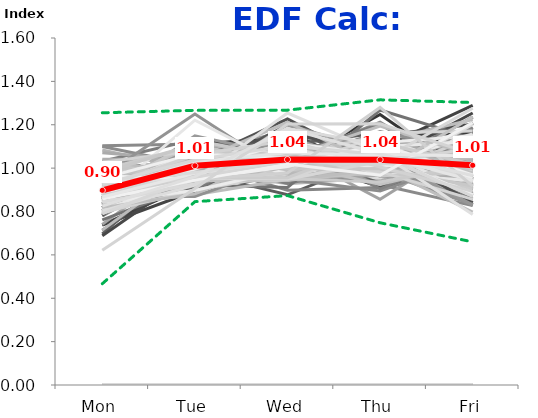
| Category | 1/1/96 | 1/8/96 | 1/15/96 | 1/22/96 | 1/29/96 | 2/5/96 | 2/12/96 | 2/19/96 | 2/26/96 | 3/4/96 | 3/11/96 | 3/18/96 | 3/25/96 | 4/1/96 | 4/8/96 | 4/15/96 | 4/22/96 | 4/29/96 | 5/6/96 | 5/13/96 | 5/20/96 | 5/27/96 | 6/3/96 | 6/10/96 | 6/17/96 | 6/24/96 | 7/1/96 | 7/8/96 | 7/15/96 | 7/22/96 | 7/29/96 | 8/5/96 | 8/12/96 | 8/19/96 | 8/26/96 | 9/2/96 | 9/9/96 | 9/16/96 | 9/23/96 | 9/30/96 | 10/7/96 | 10/14/96 | 10/21/96 | 10/28/96 | 11/4/96 | 11/11/96 | 11/18/96 | 11/25/96 | 12/2/96 | 12/9/96 | 12/16/96 | 12/23/96 | 12/30/96 | 1/6/97 | 1/13/97 | 1/20/97 | 1/27/97 | 2/3/97 | 2/10/97 | 2/17/97 | 2/24/97 | 3/3/97 | 3/10/97 | 3/17/97 | 3/24/97 | 3/31/97 | 4/7/97 | 4/14/97 | 4/21/97 | 4/28/97 | 5/5/97 | 5/12/97 | 5/19/97 | 5/26/97 | 6/2/97 | 6/9/97 | 6/16/97 | 6/23/97 | 6/30/97 | 7/7/97 | 7/14/97 | 7/21/97 | 7/28/97 | 8/4/97 | 8/11/97 | 8/18/97 | 8/25/97 | 9/1/97 | 9/8/97 | 9/15/97 | 9/22/97 | 9/29/97 | 10/6/97 | 10/13/97 | 10/20/97 | 10/27/97 | 11/3/97 | 11/10/97 | 11/17/97 | 11/24/97 | 12/1/97 | 12/8/97 | 12/15/97 | 12/22/97 | 12/29/97 | 1/5/98 | 1/12/98 | 1/19/98 | 1/26/98 | 2/2/98 | 2/9/98 | 2/16/98 | 2/23/98 | 3/2/98 | 3/9/98 | 3/16/98 | 3/23/98 | 3/30/98 | 4/6/98 | 4/13/98 | 4/20/98 | 4/27/98 | 5/4/98 | 5/11/98 | 5/18/98 | 5/25/98 | 6/1/98 | 6/8/98 | 6/15/98 | 6/22/98 | 6/29/98 | 7/6/98 | 7/13/98 | 7/20/98 | 7/27/98 | 8/3/98 | 8/10/98 | 8/17/98 | 8/24/98 | 8/31/98 | 9/7/98 | 9/14/98 | 9/21/98 | 9/28/98 | 10/5/98 | 10/12/98 | 10/19/98 | 10/26/98 | 11/2/98 | 11/9/98 | 11/16/98 | 11/23/98 | 11/30/98 | 12/7/98 | 12/14/98 | 12/21/98 | 12/28/98 | 1/4/99 | 1/11/99 | 1/18/99 | 1/25/99 | 2/1/99 | 2/8/99 | 2/15/99 | 2/22/99 | 3/1/99 | 3/8/99 | 3/15/99 | 3/22/99 | 3/29/99 | 4/5/99 | 4/12/99 | 4/19/99 | 4/26/99 | 5/3/99 | 5/10/99 | 5/17/99 | 5/24/99 | 5/31/99 | 6/7/99 | 6/14/99 | 6/21/99 | 6/28/99 | 7/5/99 | 7/12/99 | 7/19/99 | 7/26/99 | 8/2/99 | 8/9/99 | 8/16/99 | 8/23/99 | 8/30/99 | 9/6/99 | 9/13/99 | 9/20/99 | 9/27/99 | 10/4/99 | 10/11/99 | 10/18/99 | 10/25/99 | 11/1/99 | 11/8/99 | 11/15/99 | 11/22/99 | 11/29/99 | 12/6/99 | 12/13/99 | 12/20/99 | 12/27/99 | 1/3/00 | 1/10/00 | 1/17/00 | 1/24/00 | 1/31/00 | 2/7/00 | 2/14/00 | 2/21/00 | 2/28/00 | 3/6/00 | 3/13/00 | 3/20/00 | 3/27/00 | 4/3/00 | 4/10/00 | 4/17/00 | 4/24/00 | 5/1/00 | 5/8/00 | 5/15/00 | 5/22/00 | 5/29/00 | 6/5/00 | 6/12/00 | 6/19/00 | 6/26/00 | 7/3/00 | 7/10/00 | 7/17/00 | 7/24/00 | 7/31/00 | 8/7/00 | 8/14/00 | 8/21/00 | 8/28/00 | 9/4/00 | 9/11/00 | 9/18/00 | 9/25/00 | 10/2/00 | 10/9/00 | 10/16/00 | Min: | Max: | FINAL: |
|---|---|---|---|---|---|---|---|---|---|---|---|---|---|---|---|---|---|---|---|---|---|---|---|---|---|---|---|---|---|---|---|---|---|---|---|---|---|---|---|---|---|---|---|---|---|---|---|---|---|---|---|---|---|---|---|---|---|---|---|---|---|---|---|---|---|---|---|---|---|---|---|---|---|---|---|---|---|---|---|---|---|---|---|---|---|---|---|---|---|---|---|---|---|---|---|---|---|---|---|---|---|---|---|---|---|---|---|---|---|---|---|---|---|---|---|---|---|---|---|---|---|---|---|---|---|---|---|---|---|---|---|---|---|---|---|---|---|---|---|---|---|---|---|---|---|---|---|---|---|---|---|---|---|---|---|---|---|---|---|---|---|---|---|---|---|---|---|---|---|---|---|---|---|---|---|---|---|---|---|---|---|---|---|---|---|---|---|---|---|---|---|---|---|---|---|---|---|---|---|---|---|---|---|---|---|---|---|---|---|---|---|---|---|---|---|---|---|---|---|---|---|---|---|---|---|---|---|---|---|---|---|---|---|---|---|---|---|---|---|---|---|---|---|---|---|---|---|---|---|---|---|---|---|---|
| Mon | 0 | 0 | 0.714 | 0.934 | 0.832 | 0.836 | 0.944 | 0 | 0.906 | 0.921 | 0.954 | 1.103 | 0.874 | 0 | 0.928 | 0.819 | 0.903 | 0.852 | 0.888 | 0.932 | 0.973 | 0 | 0.795 | 0.873 | 0.739 | 0.839 | 0 | 0.88 | 0 | 0.844 | 0.737 | 0.898 | 0.929 | 0.895 | 0.959 | 0 | 0.799 | 0.978 | 0.696 | 0.936 | 0.947 | 0.741 | 1.009 | 0.864 | 0.865 | 0.781 | 0.83 | 0 | 0.856 | 0.837 | 0.845 | 0 | 0 | 0.968 | 0.864 | 0.78 | 0.861 | 0.888 | 0.903 | 0 | 0.905 | 0.855 | 0.957 | 0.976 | 0 | 1.083 | 1.013 | 0.851 | 0.855 | 0.817 | 1.031 | 0.96 | 0.787 | 0 | 0.907 | 0.871 | 0.792 | 0.945 | 0 | 0.965 | 0.827 | 0.837 | 0.881 | 0.848 | 0.911 | 1.015 | 0.865 | 0 | 0.886 | 0.806 | 0.911 | 0.86 | 0.932 | 0.688 | 0.799 | 0 | 1.026 | 0 | 1.013 | 0 | 0.99 | 0.864 | 0.925 | 0 | 0 | 0.945 | 1.1 | 0 | 0.837 | 1.071 | 0.924 | 0 | 0.937 | 0.937 | 1.005 | 0.863 | 1.014 | 0.783 | 0 | 0.875 | 0.919 | 1.041 | 0.95 | 0.945 | 0.969 | 0 | 0.95 | 0.913 | 0.898 | 0.858 | 0 | 0.86 | 0.872 | 0.827 | 0.939 | 0.804 | 0.859 | 0.897 | 0.762 | 0 | 0 | 0.958 | 0.814 | 0.848 | 0.882 | 0.828 | 0.963 | 0.862 | 1.006 | 0.903 | 0.913 | 0 | 0.928 | 0.946 | 0.97 | 0 | 0 | 1 | 0.988 | 0 | 0.849 | 0.94 | 0.961 | 0 | 0.944 | 0.885 | 0.872 | 0.913 | 0.887 | 0 | 0.9 | 0.867 | 0 | 0.791 | 0.931 | 0.974 | 0.924 | 0.954 | 0 | 0.97 | 0.884 | 0.993 | 0 | 0 | 0.923 | 0.893 | 0.871 | 0.869 | 0.912 | 0.883 | 0.957 | 0.858 | 0 | 0.87 | 0.714 | 0.879 | 0.919 | 0.808 | 0.885 | 0.796 | 0.922 | 0.909 | 0.869 | 0 | 0.932 | 0.904 | 0.895 | 0 | 0 | 0.872 | 1.03 | 0 | 1.009 | 0.959 | 0.908 | 0.906 | 0 | 0.877 | 0.884 | 0.818 | 0.886 | 0.843 | 0 | 0.803 | 0 | 0.865 | 1.027 | 0.875 | 0.99 | 0.945 | 0 | 0.977 | 0.79 | 0.954 | 0 | 0 | 0.864 | 0.952 | 0.843 | 0.965 | 0.914 | 0.9 | 0.928 | 0.876 | 0 | 0.858 | 0.899 | 0.867 | 0.93 | 0.622 | 0.825 | 0.467 | 1.255 | 0.898 |
| Tue | 0 | 0 | 0.992 | 0.978 | 1.064 | 1.031 | 1.037 | 0 | 0.979 | 0.984 | 0.98 | 1.111 | 1.05 | 0 | 0.947 | 1.071 | 1.03 | 0.974 | 0.97 | 1.083 | 1.035 | 0 | 0.968 | 1.05 | 0.931 | 0.985 | 0 | 0.909 | 0 | 1.068 | 0.894 | 1.014 | 1.078 | 1.019 | 1.058 | 0 | 0.955 | 1.025 | 1.069 | 1.001 | 1.079 | 1.056 | 1 | 1 | 1.068 | 1.043 | 0.987 | 0 | 1.068 | 0.98 | 0.981 | 0 | 0 | 0.988 | 1.031 | 1.011 | 1.046 | 0.97 | 0.929 | 0 | 1.061 | 1.052 | 1.006 | 0.918 | 0 | 0.99 | 1.006 | 1.066 | 1.1 | 1.113 | 1.132 | 1.022 | 1.028 | 0 | 1.112 | 0.98 | 1.03 | 1.051 | 0 | 0.986 | 1.012 | 1.053 | 1.035 | 0.977 | 0.947 | 1.088 | 1.069 | 0 | 0.958 | 1.104 | 0.977 | 1.078 | 1.031 | 0.986 | 0.959 | 0 | 0.97 | 0 | 0.915 | 0 | 0.965 | 0.953 | 0.974 | 0 | 0 | 0.94 | 1.012 | 0 | 1.034 | 1.035 | 1.103 | 0 | 0.995 | 0.968 | 1.022 | 1.071 | 0.987 | 1.062 | 0 | 0.948 | 1.039 | 1.04 | 1.005 | 1.018 | 1.063 | 0 | 1.041 | 0.947 | 1.001 | 1.06 | 0 | 1.053 | 1.062 | 0.979 | 1.066 | 1.104 | 1.149 | 1.061 | 0.922 | 0 | 0 | 0.972 | 0.927 | 0.932 | 0.913 | 0.878 | 1.25 | 1.081 | 0.932 | 1.035 | 1.039 | 0 | 1.061 | 1.025 | 1.017 | 0 | 0 | 0.878 | 0.967 | 0 | 1.045 | 0.995 | 1.002 | 0 | 1.026 | 0.997 | 0.981 | 0.944 | 1.096 | 0 | 1.018 | 0.869 | 0 | 0.991 | 1.07 | 1.057 | 1.024 | 1.045 | 0 | 1.001 | 0.92 | 1.031 | 0 | 0 | 0.997 | 1.05 | 1.023 | 0.99 | 1.115 | 1.047 | 1.027 | 1.221 | 0 | 0.971 | 1.028 | 0.997 | 1.105 | 0.958 | 0.979 | 0.899 | 0.969 | 0.963 | 1.019 | 0 | 1.04 | 1.071 | 0.941 | 0 | 0 | 0.944 | 0.981 | 0 | 0.97 | 0.946 | 1.032 | 1.067 | 0 | 1.029 | 1.129 | 0.881 | 1.026 | 0.897 | 0 | 0.921 | 0 | 1.063 | 1.08 | 0.996 | 1.107 | 0.944 | 0 | 1.11 | 0.954 | 1.067 | 0 | 0 | 1.022 | 0.957 | 0.928 | 0.949 | 1.061 | 1.028 | 1.038 | 0.95 | 0 | 0.946 | 0.957 | 0.976 | 0.98 | 0.906 | 0.961 | 0.845 | 1.267 | 1.011 |
| Wed | 0 | 0 | 1.071 | 1.118 | 1.087 | 1.024 | 0.992 | 0 | 1.016 | 0.946 | 0.877 | 1.035 | 1.046 | 0 | 1.055 | 1.099 | 1.1 | 1.001 | 1.172 | 1.053 | 1.07 | 0 | 0.954 | 1.029 | 0.95 | 0.972 | 0 | 1.011 | 0 | 1.172 | 1.058 | 1.153 | 1.022 | 1.062 | 1.01 | 0 | 0.966 | 0.899 | 1.108 | 1.045 | 1.013 | 1.015 | 1.076 | 0.988 | 1.105 | 0.948 | 1.063 | 0 | 1.031 | 1.106 | 0.945 | 0 | 0 | 1.024 | 1.025 | 1.038 | 0.963 | 1.112 | 1.084 | 0 | 1.123 | 1.041 | 1 | 1.059 | 0 | 0.927 | 1.046 | 1.046 | 1.073 | 1.136 | 0.938 | 1.05 | 1.227 | 0 | 0.998 | 0.976 | 0.929 | 1.153 | 0 | 1.098 | 1.103 | 1.126 | 1.078 | 1.057 | 1.118 | 1.028 | 1.087 | 0 | 1.012 | 1.017 | 1.199 | 1.082 | 1.085 | 0.975 | 1.014 | 0 | 1.042 | 0 | 0.957 | 0 | 1.053 | 1.061 | 0.946 | 0 | 0 | 1.015 | 0.948 | 0 | 1.07 | 1.028 | 1.02 | 0 | 1.023 | 1.018 | 1.054 | 0.996 | 1.087 | 1.066 | 0 | 1.058 | 1.07 | 0.983 | 1.048 | 1.015 | 1.113 | 0 | 1.022 | 1.024 | 1.119 | 1.157 | 0 | 1.015 | 1.099 | 1.091 | 0.976 | 1.113 | 1.056 | 0.973 | 0.911 | 0 | 0 | 1.07 | 1.201 | 1.005 | 1.054 | 0.947 | 0.972 | 0.958 | 1.139 | 1.09 | 0.966 | 0 | 0.979 | 0.987 | 0.949 | 0 | 0 | 1.105 | 1.129 | 0 | 1.042 | 1.031 | 0.983 | 0 | 1.027 | 0.994 | 1.031 | 0.944 | 1.021 | 0 | 1.056 | 1.02 | 0 | 1.057 | 1.049 | 1.05 | 1.089 | 1.121 | 0 | 0.966 | 1.067 | 1.062 | 0 | 0 | 1.018 | 1.094 | 0.976 | 1.056 | 1.057 | 1.034 | 1.212 | 1.004 | 0 | 1.041 | 1.034 | 0.963 | 1.024 | 1.012 | 1.004 | 0.973 | 0.979 | 1.11 | 1.038 | 0 | 0.976 | 0.944 | 0.947 | 0 | 0 | 1.016 | 0.943 | 0 | 1.01 | 1.002 | 1.024 | 0.996 | 0 | 1.088 | 1.044 | 1.049 | 1.037 | 0.994 | 0 | 1.105 | 0 | 0.992 | 1.053 | 1.118 | 0.951 | 1.254 | 0 | 0.998 | 0.948 | 1.045 | 0 | 0 | 1.043 | 0.956 | 1.183 | 1.008 | 1.127 | 1.071 | 1.104 | 0.977 | 0 | 1.019 | 1.031 | 1.036 | 1.033 | 1.204 | 1.183 | 0.873 | 1.267 | 1.04 |
| Thu | 0 | 0 | 1.05 | 1.064 | 1.056 | 1.051 | 0.977 | 0 | 1.029 | 0.942 | 1.047 | 0.924 | 0.956 | 0 | 1.153 | 0.981 | 1.053 | 1.098 | 0.957 | 0.922 | 1.091 | 0 | 1.166 | 1.03 | 1.092 | 1.02 | 0 | 1.247 | 0 | 1.028 | 1.15 | 0.978 | 0.966 | 1.08 | 1.094 | 0 | 1.025 | 0.911 | 1.164 | 0.915 | 0.979 | 1.101 | 1.02 | 1.1 | 1.09 | 1.06 | 0.992 | 0 | 1.001 | 1.081 | 0.994 | 0 | 0 | 1.019 | 1.043 | 1.212 | 1.012 | 0.995 | 1.141 | 0 | 0.914 | 1.057 | 1.035 | 0.977 | 0 | 0.955 | 0.949 | 1.053 | 1.07 | 0.93 | 1.041 | 0.955 | 1.006 | 0 | 0.961 | 1.103 | 1.015 | 0.955 | 0 | 1.024 | 1.063 | 1.037 | 1.037 | 1.071 | 0.998 | 0.971 | 1.069 | 0 | 1.106 | 0.99 | 0.975 | 0.856 | 1.023 | 1.149 | 1.11 | 0 | 0.942 | 0 | 1.057 | 0 | 1.057 | 1.107 | 0.944 | 0 | 0 | 0.98 | 0.894 | 0 | 1.135 | 1.031 | 1.041 | 0 | 1.083 | 1.025 | 0.957 | 0.942 | 0.975 | 1.061 | 0 | 1.08 | 1.001 | 1.06 | 1.02 | 0.974 | 1.028 | 0 | 1.01 | 1.054 | 0.905 | 1.083 | 0 | 1.109 | 1.03 | 1.094 | 1.041 | 0.995 | 0.98 | 0.955 | 1.268 | 0 | 0 | 0.932 | 1.075 | 1.105 | 1.203 | 1.123 | 0.984 | 0.989 | 1.019 | 1.054 | 1.014 | 0 | 1.077 | 1.072 | 0.967 | 0 | 0 | 0.967 | 0.963 | 0 | 0.994 | 1.008 | 1.112 | 0 | 0.973 | 1.019 | 1.11 | 1.043 | 1.05 | 0 | 1.1 | 1.168 | 0 | 1.114 | 1.01 | 1.004 | 1.023 | 1.049 | 0 | 1.044 | 0.924 | 1.01 | 0 | 0 | 1.102 | 1.086 | 1.089 | 1.15 | 0.994 | 1.036 | 1.007 | 0.975 | 0 | 0.977 | 1.12 | 1.153 | 0.924 | 1.099 | 1.095 | 1.162 | 1.051 | 1.004 | 1.106 | 0 | 0.969 | 1.107 | 0.98 | 0 | 0 | 1.022 | 0.997 | 0 | 1.021 | 1.085 | 1.032 | 1.011 | 0 | 1.024 | 0.965 | 1.193 | 1.038 | 1.117 | 0 | 0.969 | 0 | 1.102 | 0.984 | 1.059 | 0.936 | 1.071 | 0 | 0.998 | 1.032 | 1.058 | 0 | 0 | 1.07 | 1.118 | 1.107 | 1.11 | 1.005 | 1.059 | 1.061 | 1.28 | 0 | 0.967 | 1.017 | 1.064 | 1.04 | 1.205 | 1.065 | 0.748 | 1.315 | 1.039 |
| Fri | 0 | 0 | 1.173 | 0.905 | 0.961 | 1.057 | 1.049 | 0 | 1.07 | 1.206 | 1.141 | 0.827 | 1.074 | 0 | 0.917 | 1.03 | 0.914 | 1.075 | 1.013 | 1.01 | 0.831 | 0 | 1.118 | 1.019 | 1.289 | 1.183 | 0 | 0.952 | 0 | 0.888 | 1.16 | 0.957 | 1.005 | 0.943 | 0.88 | 0 | 1.254 | 1.188 | 0.964 | 1.102 | 0.982 | 1.088 | 0.895 | 1.048 | 0.872 | 1.168 | 1.128 | 0 | 1.044 | 0.997 | 1.235 | 0 | 0 | 1.001 | 1.038 | 0.959 | 1.118 | 1.036 | 0.945 | 0 | 0.997 | 0.994 | 1.003 | 1.07 | 0 | 1.044 | 0.986 | 0.983 | 0.902 | 1.004 | 0.858 | 1.013 | 0.951 | 0 | 1.023 | 1.07 | 1.234 | 0.896 | 0 | 0.927 | 0.996 | 0.946 | 0.969 | 1.047 | 1.026 | 0.899 | 0.909 | 0 | 1.038 | 1.084 | 0.938 | 1.124 | 0.928 | 1.202 | 1.118 | 0 | 1.021 | 0 | 1.058 | 0 | 0.935 | 1.015 | 1.211 | 0 | 0 | 1.12 | 1.045 | 0 | 0.923 | 0.834 | 0.912 | 0 | 0.962 | 1.052 | 0.961 | 1.129 | 0.936 | 1.028 | 0 | 1.039 | 0.971 | 0.875 | 0.978 | 1.048 | 0.828 | 0 | 0.977 | 1.063 | 1.077 | 0.841 | 0 | 0.963 | 0.937 | 1.01 | 0.978 | 0.983 | 0.956 | 1.115 | 1.137 | 0 | 0 | 1.067 | 0.983 | 1.109 | 0.948 | 1.224 | 0.831 | 1.11 | 0.904 | 0.917 | 1.068 | 0 | 0.955 | 0.97 | 1.098 | 0 | 0 | 1.05 | 0.953 | 0 | 1.069 | 1.026 | 0.942 | 0 | 1.031 | 1.104 | 1.007 | 1.157 | 0.946 | 0 | 0.926 | 1.075 | 0 | 1.048 | 0.94 | 0.916 | 0.94 | 0.831 | 0 | 1.019 | 1.205 | 0.904 | 0 | 0 | 0.961 | 0.878 | 1.041 | 0.935 | 0.922 | 1.001 | 0.798 | 0.941 | 0 | 1.14 | 1.104 | 1.009 | 1.027 | 1.124 | 1.037 | 1.171 | 1.079 | 1.014 | 0.967 | 0 | 1.083 | 0.973 | 1.237 | 0 | 0 | 1.146 | 1.05 | 0 | 0.99 | 1.008 | 1.004 | 1.019 | 0 | 0.982 | 0.978 | 1.058 | 1.013 | 1.149 | 0 | 1.202 | 0 | 0.977 | 0.856 | 0.953 | 1.016 | 0.786 | 0 | 0.918 | 1.276 | 0.877 | 0 | 0 | 1.001 | 1.018 | 0.938 | 0.969 | 0.893 | 0.943 | 0.869 | 0.917 | 0 | 1.21 | 1.095 | 1.056 | 1.017 | 1.065 | 0.966 | 0.66 | 1.303 | 1.013 |